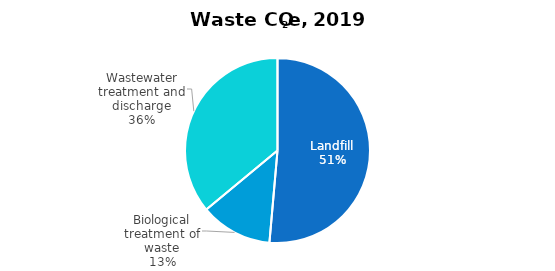
| Category | Series 0 |
|---|---|
| Landfill | 0.274 |
| Biological treatment of waste | 0.067 |
| Wastewater treatment and discharge | 0.192 |